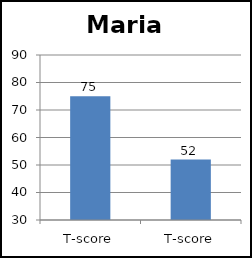
| Category | Maria |
|---|---|
| T-score | 75 |
| T-score | 52 |